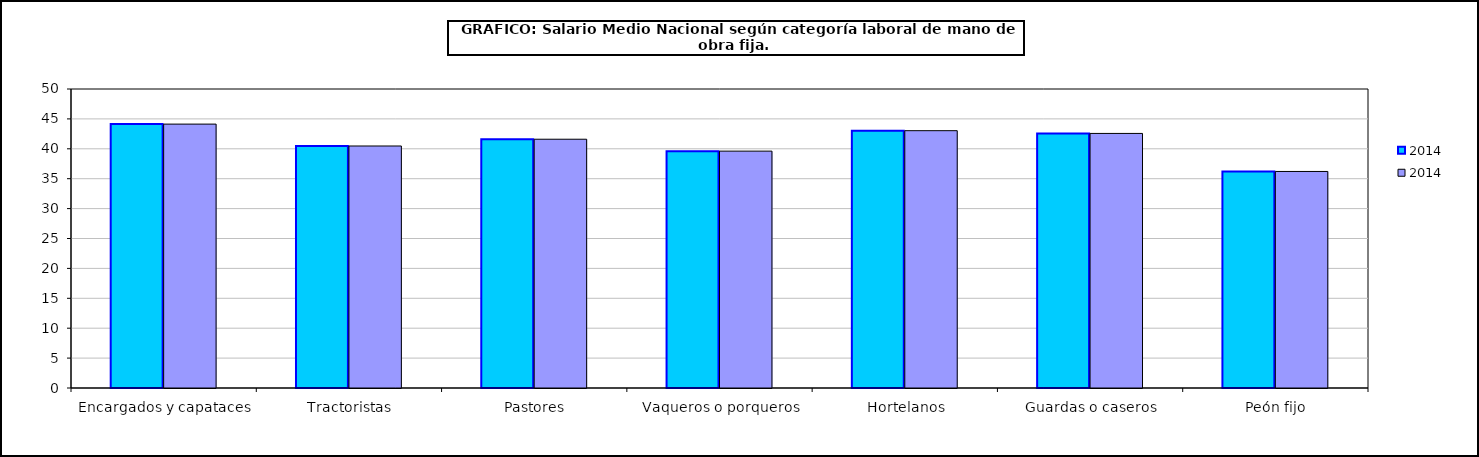
| Category | 2014 |
|---|---|
|  Encargados y capataces | 44.13 |
|  Tractoristas | 40.47 |
|  Pastores | 41.6 |
|  Vaqueros o porqueros | 39.61 |
|  Hortelanos | 43.03 |
|  Guardas o caseros | 42.57 |
|  Peón fijo | 36.21 |